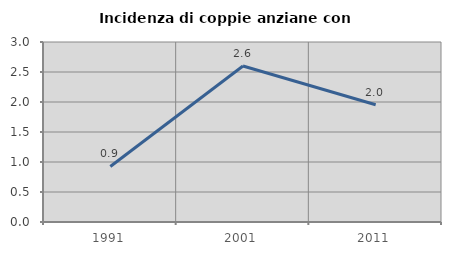
| Category | Incidenza di coppie anziane con figli |
|---|---|
| 1991.0 | 0.926 |
| 2001.0 | 2.6 |
| 2011.0 | 1.955 |